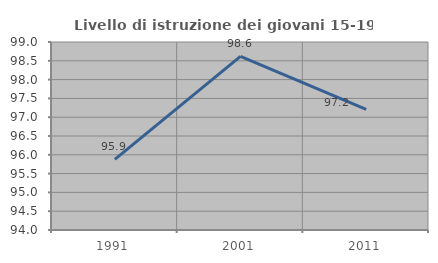
| Category | Livello di istruzione dei giovani 15-19 anni |
|---|---|
| 1991.0 | 95.876 |
| 2001.0 | 98.618 |
| 2011.0 | 97.211 |